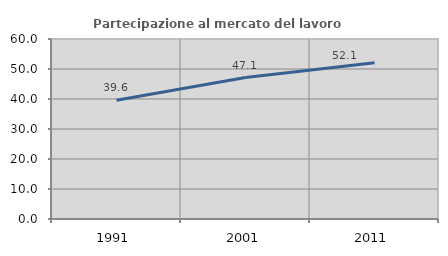
| Category | Partecipazione al mercato del lavoro  femminile |
|---|---|
| 1991.0 | 39.609 |
| 2001.0 | 47.141 |
| 2011.0 | 52.086 |